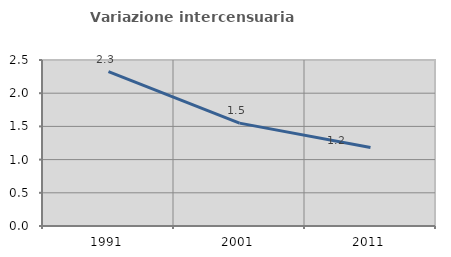
| Category | Variazione intercensuaria annua |
|---|---|
| 1991.0 | 2.323 |
| 2001.0 | 1.549 |
| 2011.0 | 1.181 |